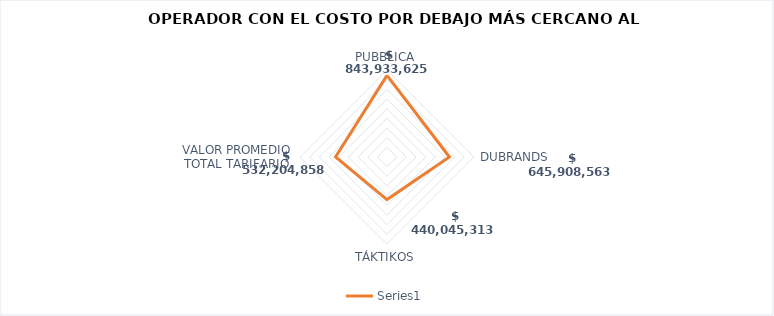
| Category | Series 0 |
|---|---|
| PUBBLICA | 843933624.8 |
| DUBRANDS | 645908562.727 |
| TÁKTIKOS | 440045312.63 |
| VALOR PROMEDIO TOTAL TARIFARIO | 532204858.432 |